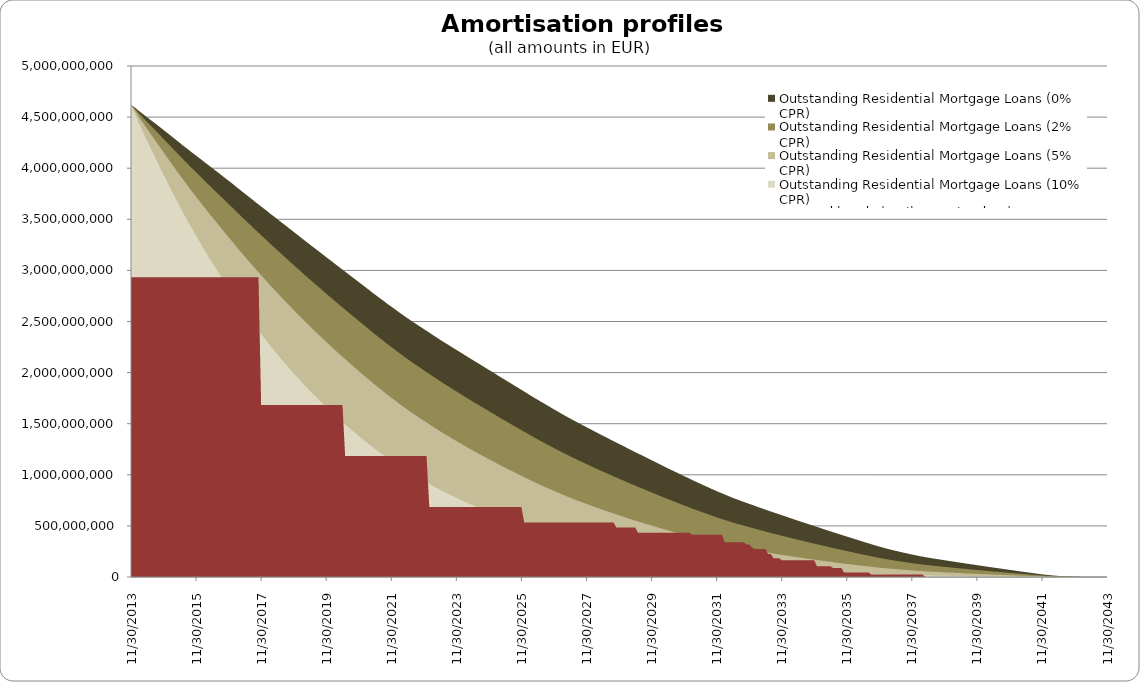
| Category | Outstanding Residential Mortgage Loans (0% CPR) | Outstanding Residential Mortgage Loans (2% CPR) | Outstanding Residential Mortgage Loans (5% CPR) | Outstanding Residential Mortgage Loans (10% CPR) | Covered bonds (until maturity date) |
|---|---|---|---|---|---|
| 11/30/13 | 4621074291.54 | 4621074291.54 | 4621074291.54 | 4621074291.54 | 2934000000 |
| 12/31/13 | 4601252980.262 | 4593513014.77 | 4581627168.501 | 4561030616.596 | 2934000000 |
| 1/31/14 | 4580651775.31 | 4565254115.916 | 4541659229.008 | 4500917258.503 | 2934000000 |
| 2/28/14 | 4559665125.302 | 4536693783.183 | 4501568352.734 | 4441130917.11 | 2934000000 |
| 3/31/14 | 4538963373.939 | 4508499608.352 | 4462016919.609 | 4382320956.442 | 2934000000 |
| 4/30/14 | 4518587627.42 | 4480710720.265 | 4423040103.859 | 4324511812.636 | 2934000000 |
| 5/31/14 | 4497774822.879 | 4452569901.039 | 4383888614.125 | 4266963852.63 | 2934000000 |
| 6/30/14 | 4477035793.324 | 4424583983.613 | 4345062242.59 | 4210160934.3 | 2934000000 |
| 7/31/14 | 4456941978.755 | 4397316206.714 | 4307110856.578 | 4154626499.014 | 2934000000 |
| 8/31/14 | 4436560420.215 | 4369844227.633 | 4269127283.019 | 4099475382.028 | 2934000000 |
| 9/30/14 | 4416366118.56 | 4342636361.277 | 4231568798.787 | 4045142520.036 | 2934000000 |
| 10/31/14 | 4395369128.176 | 4314719704.374 | 4193487222.06 | 3990717517.311 | 2934000000 |
| 11/30/14 | 4374080577.144 | 4286598948.105 | 4155376539.539 | 3936672519.43 | 2934000000 |
| 12/31/14 | 4352986486.934 | 4258750841.56 | 4117698621.928 | 3883440934.704 | 2934000000 |
| 1/31/15 | 4331947327.743 | 4231037946.011 | 4080318261.407 | 3830887762.307 | 2934000000 |
| 2/28/15 | 4311955959.469 | 4204427894.436 | 4044164586.459 | 3779875129.674 | 2934000000 |
| 3/31/15 | 4290933717.054 | 4176891919.646 | 4007282363.256 | 3728565853.562 | 2934000000 |
| 4/30/15 | 4269622600.501 | 4149155963.09 | 3970372565.841 | 3677615969.635 | 2934000000 |
| 5/31/15 | 4248157493.559 | 4121352103.711 | 3933562140.278 | 3627140450.174 | 2934000000 |
| 6/30/15 | 4226779486.51 | 4093714402.846 | 3897073804.805 | 3577340097.655 | 2934000000 |
| 7/31/15 | 4205687374.473 | 4066434449.566 | 3861087646.14 | 3528373097.802 | 2934000000 |
| 8/31/15 | 4185111866.955 | 4039733351.445 | 3825809826.614 | 3480418449.427 | 2934000000 |
| 9/30/15 | 4164024399.961 | 4012617233.167 | 3790296693.366 | 3432610545.158 | 2934000000 |
| 10/31/15 | 4143877432.152 | 3986485686.486 | 3755869343.318 | 3386141041.547 | 2934000000 |
| 11/30/15 | 4123330895.158 | 3960046954.6 | 3721306112.263 | 3339898016.831 | 2934000000 |
| 12/31/15 | 4103141311.476 | 3934028130.73 | 3687290175.77 | 3294491320.889 | 2934000000 |
| 1/31/16 | 4082823829.84 | 3907963213.702 | 3653382269.517 | 3249521466.339 | 2934000000 |
| 2/29/16 | 4062377747.168 | 3881851968.644 | 3619581952.625 | 3204984621.042 | 2934000000 |
| 3/31/16 | 4042111152.922 | 3855988737.386 | 3586162748.938 | 3161118475.542 | 2934000000 |
| 4/30/16 | 4021824648.927 | 3830182572.839 | 3552945193.207 | 3117758907.295 | 2934000000 |
| 5/31/16 | 4001475310.898 | 3804392576.121 | 3519890490.552 | 3074867558.273 | 2934000000 |
| 6/30/16 | 3980975869.834 | 3778536037.306 | 3486921652.603 | 3032373509.308 | 2934000000 |
| 7/31/16 | 3959728800.956 | 3752047305.475 | 3453517969.9 | 2989822921.208 | 2934000000 |
| 8/31/16 | 3938960513.928 | 3726089906.038 | 3420751597.423 | 2948142880.551 | 2934000000 |
| 9/30/16 | 3918192509.369 | 3700209483.88 | 3388202160.882 | 2906963280.109 | 2934000000 |
| 10/31/16 | 3897396493.908 | 3674379180.662 | 3355844037.634 | 2866257747.458 | 2934000000 |
| 11/30/16 | 3876961200.552 | 3648964815.87 | 3324009582.185 | 2826304707.449 | 2934000000 |
| 12/31/16 | 3856518534.664 | 3623618625.268 | 3292379348.224 | 2786825822.921 | 2934000000 |
| 1/31/17 | 3835523416.758 | 3597829168.87 | 3260488839.581 | 2747425454.782 | 2934000000 |
| 2/28/17 | 3814011280.709 | 3571632057.605 | 3228372850.183 | 2708133866.073 | 2934000000 |
| 3/31/17 | 3793302379.988 | 3546263828.022 | 3197148510.443 | 2669884623.343 | 2934000000 |
| 4/30/17 | 3772406788.682 | 3520796596.356 | 3165975123.551 | 2631966904.837 | 2934000000 |
| 5/31/17 | 3751291790.485 | 3495200583.214 | 3134826150.093 | 2594356350.79 | 2934000000 |
| 6/30/17 | 3730357055.096 | 3469848394.562 | 3104035294.472 | 2557325803.191 | 2934000000 |
| 7/31/17 | 3709323956.133 | 3444480265.793 | 3073368572.588 | 2520677578.288 | 2934000000 |
| 8/31/17 | 3688350794.591 | 3419243228.663 | 3042956437.625 | 2484515035.473 | 2934000000 |
| 9/30/17 | 3666586600.319 | 3393349266.935 | 3012097988.225 | 2448263918.531 | 2934000000 |
| 10/31/17 | 3646099663.8 | 3368712831.161 | 2982492213.307 | 2413302132.477 | 2934000000 |
| 11/30/17 | 3625448767.179 | 3343998446.925 | 2952950647.293 | 2378656932.521 | 1684000000 |
| 12/31/17 | 3604673633.879 | 3319243276.402 | 2923506070.355 | 2344352226.959 | 1684000000 |
| 1/31/18 | 3583946178.986 | 3294605756.595 | 2894297454.397 | 2310496247.213 | 1684000000 |
| 2/28/18 | 3563362598.021 | 3270173766.517 | 2865400512.245 | 2277144978.529 | 1684000000 |
| 3/31/18 | 3542708820.356 | 3245750340.538 | 2836641220.356 | 2244155770.158 | 1684000000 |
| 4/30/18 | 3522177680.612 | 3221511994.965 | 2808172909.013 | 2211646316.403 | 1684000000 |
| 5/31/18 | 3501551113.3 | 3197258877.257 | 2779820085.175 | 2179474346.173 | 1684000000 |
| 6/30/18 | 3480560590.414 | 3172746470.111 | 2751370334.779 | 2147471284.033 | 1684000000 |
| 7/31/18 | 3459784586.482 | 3148502702.112 | 2723281558.721 | 2115992392.951 | 1684000000 |
| 8/31/18 | 3439223274.455 | 3124526565.32 | 2695550609.227 | 2085029911.478 | 1684000000 |
| 9/30/18 | 3418477731.022 | 3100455089.744 | 2667862902.282 | 2054336342.68 | 1684000000 |
| 10/31/18 | 3397728402.526 | 3076452330.208 | 2640359407.655 | 2024017812.2 | 1684000000 |
| 11/30/18 | 3376773101.955 | 3052335366.072 | 2612882621.099 | 1993950738.843 | 1684000000 |
| 12/31/18 | 3356278730.223 | 3028706775.292 | 2585947330.983 | 1964524463.677 | 1684000000 |
| 1/31/19 | 3335489959.821 | 3004883823.269 | 2558968417.913 | 1935289472.719 | 1684000000 |
| 2/28/19 | 3315007106.901 | 2981407579.021 | 2532406302.197 | 1906591427.194 | 1684000000 |
| 3/31/19 | 3294527784.11 | 2958004982.019 | 2506026909.916 | 1878249240.923 | 1684000000 |
| 4/30/19 | 3274023946.796 | 2934650708.893 | 2479807911.018 | 1850243020.806 | 1684000000 |
| 5/31/19 | 3253359113.12 | 2911222572.305 | 2453645561.001 | 1822492725.1 | 1684000000 |
| 6/30/19 | 3232900398.663 | 2888049082.414 | 2427816068.2 | 1795200660.152 | 1684000000 |
| 7/31/19 | 3212477783.968 | 2864977511.834 | 2402189272.966 | 1768266354.488 | 1684000000 |
| 8/31/19 | 3191926135.599 | 2841860507.04 | 2376640844.542 | 1741595361.657 | 1684000000 |
| 9/30/19 | 3171529484.01 | 2818950931.856 | 2351381572.351 | 1715339370.989 | 1684000000 |
| 10/31/19 | 3151057307.56 | 2796043376.134 | 2326238787.135 | 1689368842.182 | 1684000000 |
| 11/30/19 | 3130270164.737 | 2772925900.777 | 2301036177.174 | 1663553897.227 | 1684000000 |
| 12/31/19 | 3109853789.624 | 2750206174.256 | 2276277626.948 | 1638256506.224 | 1684000000 |
| 1/31/20 | 3089623865.296 | 2727719649.211 | 2251824310.57 | 1613371634.733 | 1684000000 |
| 2/29/20 | 3069353296.085 | 2705265168.577 | 2227508689.053 | 1588775602.088 | 1684000000 |
| 3/31/20 | 3048432803.796 | 2682306650.129 | 2202889871.907 | 1564152825.673 | 1684000000 |
| 4/30/20 | 3028224903.328 | 2660043668.629 | 2178953287.812 | 1540201563.097 | 1684000000 |
| 5/31/20 | 3008093508.628 | 2637915084.9 | 2155235636.45 | 1516588091.754 | 1684000000 |
| 6/30/20 | 2987752004.855 | 2615669479.529 | 2131530774.478 | 1493164759.099 | 1184000000 |
| 7/31/20 | 2967175344.902 | 2593285724.834 | 2107821870.185 | 1469918554.35 | 1184000000 |
| 8/31/20 | 2946667697.514 | 2571030088.476 | 2084325254.397 | 1446998557.237 | 1184000000 |
| 9/30/20 | 2926440328.145 | 2549086128.416 | 2061188141.544 | 1424503381.943 | 1184000000 |
| 10/31/20 | 2906029206.193 | 2527048927.419 | 2038081612.691 | 1402202258.146 | 1184000000 |
| 11/30/20 | 2885564656.009 | 2505032271.322 | 2015097384.684 | 1380156621.062 | 1184000000 |
| 12/31/20 | 2865046229.902 | 2483035843.792 | 1992234687.207 | 1358363719.707 | 1184000000 |
| 1/31/21 | 2844933320.546 | 2461457185.057 | 1969811139.946 | 1337036942.792 | 1184000000 |
| 2/28/21 | 2825282380.935 | 2440343126.279 | 1947861133.632 | 1316194441.071 | 1184000000 |
| 3/31/21 | 2805622489.746 | 2419285416.784 | 1926056393.906 | 1295610028.384 | 1184000000 |
| 4/30/21 | 2783943236.362 | 2396553281.157 | 1903021848.668 | 1274360548.102 | 1184000000 |
| 5/31/21 | 2763954445.915 | 2375343561.929 | 1881299382.98 | 1254150623.358 | 1184000000 |
| 6/30/21 | 2744137347.994 | 2354345721.758 | 1859843966.679 | 1234273877.914 | 1184000000 |
| 7/31/21 | 2723945014.857 | 2333090407.649 | 1838284120.474 | 1214481505.536 | 1184000000 |
| 8/31/21 | 2704683338.298 | 2312695718.778 | 1817499744.258 | 1195352160.018 | 1184000000 |
| 9/30/21 | 2683581890.655 | 2290792554.576 | 1795628205.622 | 1175658460.008 | 1184000000 |
| 10/31/21 | 2664406662.974 | 2270598051.414 | 1775193548.879 | 1157054211.185 | 1184000000 |
| 11/30/21 | 2645454065.754 | 2250654413.534 | 1755048242.103 | 1138781222.932 | 1184000000 |
| 12/31/21 | 2626938360.736 | 2231142512.33 | 1735331097.861 | 1120925710.475 | 1184000000 |
| 1/31/22 | 2607020992.682 | 2210501410.878 | 1714828248.837 | 1102702483.198 | 1184000000 |
| 2/28/22 | 2588380923.73 | 2191004644.808 | 1695305320.542 | 1085247742.158 | 1184000000 |
| 3/31/22 | 2569766890.124 | 2171589217.23 | 1675934717.509 | 1068024720.68 | 1184000000 |
| 4/30/22 | 2550912115.577 | 2152029811.881 | 1656542180.752 | 1050920704.67 | 1184000000 |
| 5/31/22 | 2532430473.223 | 2132844321.362 | 1637525860.175 | 1034186485.985 | 1184000000 |
| 6/30/22 | 2514733619.1 | 2114377133.113 | 1619146919.698 | 1017982217.255 | 1184000000 |
| 7/31/22 | 2495960647.858 | 2095062765.731 | 1600205054.029 | 1001550410.185 | 1184000000 |
| 8/31/22 | 2478303528.994 | 2076742446.86 | 1582107659.59 | 985771937.334 | 1184000000 |
| 9/30/22 | 2460771968.582 | 2058582871.431 | 1564215345.534 | 970242293.854 | 1184000000 |
| 10/31/22 | 2443526588.396 | 2040717517.492 | 1546628020.926 | 955020679.422 | 1184000000 |
| 11/30/22 | 2426254166.796 | 2022883896.691 | 1529145225.592 | 939980570.886 | 1184000000 |
| 12/31/22 | 2409109933.989 | 2005211195.829 | 1511863877.742 | 925179661.841 | 1184000000 |
| 1/31/23 | 2391637360.125 | 1987319393.205 | 1494496955.723 | 910440699.165 | 684000000 |
| 2/28/23 | 2374440866.519 | 1969711130.927 | 1477422463.717 | 895992900.787 | 684000000 |
| 3/31/23 | 2357154112.644 | 1952081737.122 | 1460410515.444 | 881694363.267 | 684000000 |
| 4/30/23 | 2340129209.119 | 1934722566.544 | 1443678352.652 | 867674430.33 | 684000000 |
| 5/31/23 | 2322290117.016 | 1916744267.455 | 1426562208.558 | 853532990.83 | 684000000 |
| 6/30/23 | 2305470486.867 | 1899660995.401 | 1410189385.146 | 839943901.115 | 684000000 |
| 7/31/23 | 2289060245.302 | 1882966532.127 | 1394179622.569 | 826675016.828 | 684000000 |
| 8/31/23 | 2272542859.726 | 1866234871.84 | 1378215798.761 | 813535573.876 | 684000000 |
| 9/30/23 | 2255782053.727 | 1849354609.176 | 1362215797.06 | 800476300.874 | 684000000 |
| 10/31/23 | 2239392637.208 | 1832829820.057 | 1346550528.06 | 787713817.315 | 684000000 |
| 11/30/23 | 2223061478.074 | 1816402993.101 | 1331028993.468 | 775133605.976 | 684000000 |
| 12/31/23 | 2206629762.595 | 1799944221.104 | 1315555418.755 | 762678389.283 | 684000000 |
| 1/31/24 | 2190103670.03 | 1783458827.693 | 1300133602.598 | 750349361.882 | 684000000 |
| 2/29/24 | 2173447396.703 | 1766917971.213 | 1284742458.92 | 738133394.569 | 684000000 |
| 3/31/24 | 2157005113.71 | 1750601388.117 | 1269584910.023 | 726145702.631 | 684000000 |
| 4/30/24 | 2140638472.661 | 1734395985.15 | 1254577623.399 | 714336429.189 | 684000000 |
| 5/31/24 | 2124384035.739 | 1718330906.923 | 1239740740.442 | 702715246.384 | 684000000 |
| 6/30/24 | 2108091705.647 | 1702284370.632 | 1224985583.006 | 691230229.626 | 684000000 |
| 7/31/24 | 2091805546.79 | 1686291930.576 | 1210337312.718 | 679894314.809 | 684000000 |
| 8/31/24 | 2075588049.252 | 1670403734.722 | 1195831272.58 | 668725888.621 | 684000000 |
| 9/30/24 | 2059148945.651 | 1654386174.235 | 1181299827.7 | 657629993.12 | 684000000 |
| 10/31/24 | 2042601162.961 | 1638330604.983 | 1166808508.762 | 646642582.798 | 684000000 |
| 11/30/24 | 2026222536.19 | 1622459819.676 | 1152515534.604 | 635850097.658 | 684000000 |
| 12/31/24 | 2010059004.711 | 1606809735.063 | 1138445084.362 | 625263796.281 | 684000000 |
| 1/31/25 | 1993900454.198 | 1591211686.402 | 1124476505.147 | 614815524.312 | 684000000 |
| 2/28/25 | 1977719252.578 | 1575643521.444 | 1110593655.347 | 604495217.526 | 684000000 |
| 3/31/25 | 1961200786.207 | 1559854983.564 | 1096620193.333 | 594206177.282 | 684000000 |
| 4/30/25 | 1945055489.382 | 1544411409.47 | 1082953500.825 | 584162905.116 | 684000000 |
| 5/31/25 | 1928931595.657 | 1529032343.023 | 1069395307.602 | 574256185.858 | 684000000 |
| 6/30/25 | 1912744652.486 | 1513650752.355 | 1055898268.209 | 564459422.32 | 684000000 |
| 7/31/25 | 1896478754.264 | 1498254207.242 | 1042453511.584 | 554766960.196 | 684000000 |
| 8/31/25 | 1880224340.931 | 1482914235.101 | 1029110523.277 | 545204149.003 | 684000000 |
| 9/30/25 | 1863968368.066 | 1467620404.67 | 1015861543.424 | 535765686.288 | 684000000 |
| 10/31/25 | 1847715173.119 | 1452376013.278 | 1002708371.491 | 526451367.43 | 684000000 |
| 11/30/25 | 1831606087.366 | 1437291840.619 | 989726793.581 | 517299651.895 | 684000000 |
| 12/31/25 | 1814586869.128 | 1421541310.7 | 976348013.29 | 508012908.475 | 534000000 |
| 1/31/26 | 1798479514.298 | 1406552853.237 | 963553897.147 | 499102051.539 | 534000000 |
| 2/28/26 | 1782595464.337 | 1391785145.822 | 950970286.466 | 490369592.536 | 534000000 |
| 3/31/26 | 1766177259.3 | 1376646794.114 | 938192750.809 | 481606012.003 | 534000000 |
| 4/30/26 | 1750252699.007 | 1361939559.406 | 925768019.326 | 473091606.796 | 534000000 |
| 5/31/26 | 1734664906.84 | 1347539519.278 | 913609578.401 | 464779490.453 | 534000000 |
| 6/30/26 | 1719118710.748 | 1333216330.278 | 901559828.806 | 456587592.514 | 534000000 |
| 7/31/26 | 1703499101.892 | 1318880677.844 | 889557914.571 | 448484072.091 | 534000000 |
| 8/31/26 | 1687770844.368 | 1304505506.825 | 877585488.627 | 440458981.733 | 534000000 |
| 9/30/26 | 1672191238.74 | 1290289667.041 | 865775975.427 | 432578378.997 | 534000000 |
| 10/31/26 | 1656151015.445 | 1275763139.966 | 853813772.183 | 424683782.415 | 534000000 |
| 11/30/26 | 1640656397.727 | 1261701417.194 | 842217944.805 | 417032838.693 | 534000000 |
| 12/31/26 | 1625702759.267 | 1248098716.355 | 830982026.405 | 409619512.944 | 534000000 |
| 1/31/27 | 1609948337.807 | 1233924458.778 | 819419060.076 | 402103923.187 | 534000000 |
| 2/28/27 | 1595061504.001 | 1220458189.846 | 808379309.205 | 394903224.869 | 534000000 |
| 3/31/27 | 1580381196.069 | 1207191491.274 | 797523048.419 | 387848374.122 | 534000000 |
| 4/30/27 | 1565759246.303 | 1194010474.678 | 786774015.561 | 380900884.94 | 534000000 |
| 5/31/27 | 1551225639.846 | 1180937641.418 | 776146371.738 | 374066526.584 | 534000000 |
| 6/30/27 | 1536618221.037 | 1167849312.331 | 765558299.605 | 367304904.916 | 534000000 |
| 7/31/27 | 1522362795.01 | 1155068743.262 | 755221048.779 | 360716316.403 | 534000000 |
| 8/31/27 | 1508067752.044 | 1142297859.666 | 744938484.151 | 354205544.765 | 534000000 |
| 9/30/27 | 1494082433.552 | 1129800879.824 | 734882237.97 | 347853147.712 | 534000000 |
| 10/31/27 | 1480177104.203 | 1117403096.925 | 724937401.536 | 341603204.377 | 534000000 |
| 11/30/27 | 1466157315.085 | 1104957564.113 | 715008211.454 | 335409763.763 | 534000000 |
| 12/31/27 | 1451903832.101 | 1092374915.914 | 705037055.505 | 329245506.782 | 534000000 |
| 1/31/28 | 1438200164.325 | 1080244442.913 | 695403800.076 | 323286980.251 | 534000000 |
| 2/29/28 | 1424228338.973 | 1067950612.775 | 685710787.7 | 317347717.812 | 534000000 |
| 3/31/28 | 1410659879.5 | 1055997038.59 | 676281188.564 | 311576680.976 | 534000000 |
| 4/30/28 | 1397111755.722 | 1044095855.466 | 666929262.054 | 305886742.4 | 534000000 |
| 5/31/28 | 1383644087.245 | 1032291748.08 | 657683052.681 | 300289933.745 | 534000000 |
| 6/30/28 | 1370203613.71 | 1020544654.348 | 648516457.813 | 294773451.747 | 534000000 |
| 7/31/28 | 1356240526.773 | 1008445565.942 | 639169796.308 | 289219020.635 | 534000000 |
| 8/31/28 | 1342495308.682 | 996546021.181 | 629993309.161 | 283785228.839 | 534000000 |
| 9/30/28 | 1328920870.246 | 984810214.392 | 620963274.953 | 278460120.322 | 534000000 |
| 10/31/28 | 1315553873.272 | 973264537.789 | 612095328.208 | 273249514.187 | 484000000 |
| 11/30/28 | 1302234695.84 | 961790235.673 | 603313887.94 | 268118573.052 | 484000000 |
| 12/31/28 | 1288850312.223 | 950303703.684 | 594566142.889 | 263043148.615 | 484000000 |
| 1/31/29 | 1275540792.06 | 938908200.343 | 585916434.439 | 258051115.465 | 484000000 |
| 2/28/29 | 1262223885.099 | 927542917.144 | 577326318.376 | 253124777.418 | 484000000 |
| 3/31/29 | 1249006137.582 | 916285958.05 | 568843981.735 | 248284559.364 | 484000000 |
| 4/30/29 | 1235793326.982 | 905067862.53 | 560425741.383 | 243510594.845 | 484000000 |
| 5/31/29 | 1222304973.927 | 893683452.36 | 551944540.061 | 238747300.849 | 484000000 |
| 6/30/29 | 1209104418.97 | 882544850.906 | 543654897.642 | 234104399.947 | 434000000 |
| 7/31/29 | 1195907268.064 | 871443674.784 | 535427453.455 | 229525081.242 | 434000000 |
| 8/31/29 | 1182743984.103 | 860401985.424 | 527275401.844 | 225014377.071 | 434000000 |
| 9/30/29 | 1169597572.109 | 849407230.819 | 519190640.659 | 220568176.847 | 434000000 |
| 10/31/29 | 1156466776.3 | 838458352.618 | 511172158.032 | 216185435.2 | 434000000 |
| 11/30/29 | 1143082188.541 | 827360212.111 | 503100932.031 | 211815435.133 | 434000000 |
| 12/31/29 | 1129572930.173 | 816206952.469 | 495034621.628 | 207482417.154 | 434000000 |
| 1/31/30 | 1116624082.909 | 805493135.166 | 487272522.263 | 203311005.948 | 434000000 |
| 2/28/30 | 1103731054.812 | 794853251.326 | 479591886.837 | 199206743.802 | 434000000 |
| 3/31/30 | 1090875757.544 | 784274009.862 | 471984231.987 | 195165452.06 | 434000000 |
| 4/30/30 | 1077790109.798 | 773562780.511 | 464333510.314 | 191138740.533 | 434000000 |
| 5/31/30 | 1064223167.935 | 762540509.986 | 456533000.202 | 187082907.801 | 434000000 |
| 6/30/30 | 1051193364.651 | 751937357.564 | 449020026.117 | 183176978.008 | 434000000 |
| 7/31/30 | 1038401113.913 | 741537358.719 | 441663875.777 | 179366073.152 | 434000000 |
| 8/31/30 | 1025738802.237 | 731262855.981 | 434417340.261 | 175630046.215 | 434000000 |
| 9/30/30 | 1013097413.347 | 721035712.74 | 427233410.479 | 171949181.289 | 434000000 |
| 10/31/30 | 999862685.709 | 710419329.876 | 419853711.168 | 168219424.897 | 434000000 |
| 11/30/30 | 987363038.355 | 700358031.846 | 412836544.617 | 164664326.958 | 434000000 |
| 12/31/30 | 974922140.156 | 690370174.174 | 405896059.624 | 161168241.631 | 434000000 |
| 1/31/31 | 962209455.776 | 680221801.849 | 398894598.871 | 157676158.902 | 434000000 |
| 2/28/31 | 949896055.064 | 670387411.101 | 392110302.623 | 154297670.862 | 414000000 |
| 3/31/31 | 937078333.401 | 660228857.03 | 385169331.467 | 150884996.63 | 414000000 |
| 4/30/31 | 924844384.239 | 650513193.783 | 378519363.465 | 147613371.718 | 414000000 |
| 5/31/31 | 912666343.941 | 640867606.832 | 371941901.391 | 144396260.73 | 414000000 |
| 6/30/31 | 900447141.939 | 631223775.528 | 365396959.669 | 141217660.136 | 414000000 |
| 7/31/31 | 888365594.916 | 621706909.991 | 358956704.989 | 138104997.351 | 414000000 |
| 8/31/31 | 876353299.347 | 612268659.049 | 352592604.288 | 135046634.091 | 414000000 |
| 9/30/31 | 864259986.792 | 602803893.971 | 346243806.319 | 132018812.219 | 414000000 |
| 10/31/31 | 852439662.325 | 593559322.062 | 340051651.553 | 129074942.358 | 414000000 |
| 11/30/31 | 840650637.156 | 584365903.432 | 333918453.542 | 126177149.706 | 414000000 |
| 12/31/31 | 829068159.438 | 575345071.221 | 327913082.361 | 123350887.321 | 414000000 |
| 1/31/32 | 817957548.759 | 566679843.004 | 322138703.111 | 120633987.395 | 414000000 |
| 2/29/32 | 807226550.18 | 558304691.713 | 316556482.85 | 118010657.943 | 339000000 |
| 3/31/32 | 796549386.486 | 549993284.425 | 311037043.334 | 115431775.916 | 339000000 |
| 4/30/32 | 785322801.124 | 541329538.344 | 305345306.123 | 112810039.527 | 339000000 |
| 5/31/32 | 774523291.563 | 532987275.21 | 299861809.604 | 110286131.203 | 339000000 |
| 6/30/32 | 764431162.697 | 525157510.063 | 294692234.892 | 107897573.527 | 339000000 |
| 7/31/32 | 754424147.214 | 517410951.993 | 289593975.888 | 105554256.454 | 339000000 |
| 8/31/32 | 744616488.678 | 509825465.747 | 284610046.301 | 103271312.052 | 339000000 |
| 9/30/32 | 734920784.087 | 502340559.35 | 279705972.754 | 101035606.382 | 339000000 |
| 10/31/32 | 725299846.74 | 494930411.143 | 274866890.897 | 98841285.398 | 319000000 |
| 11/30/32 | 715746450.917 | 487589783.491 | 270089487.773 | 96686730.999 | 319000000 |
| 12/31/32 | 706264835.12 | 480321267.367 | 265374809.521 | 94571904.011 | 289000000 |
| 1/31/33 | 696835122.061 | 473111064.177 | 260714855.594 | 92493552.123 | 274000000 |
| 2/28/33 | 687478397.932 | 465973230.731 | 256117017.871 | 90453912.866 | 274000000 |
| 3/31/33 | 678156500.963 | 458881639.032 | 251566578.325 | 88447407.416 | 274000000 |
| 4/30/33 | 668876628.555 | 451840974.862 | 247065820.406 | 86474502.918 | 274000000 |
| 5/31/33 | 659642861.595 | 444853792.124 | 242615837.751 | 84535241.326 | 274000000 |
| 6/30/33 | 650270226.007 | 437795344.59 | 238148463.57 | 82605635.211 | 224000000 |
| 7/31/33 | 641132326.667 | 430917155.436 | 233800385.599 | 80732863.59 | 224000000 |
| 8/31/33 | 632053359.437 | 424100410.422 | 229506465.998 | 78893877.479 | 184000000 |
| 9/30/33 | 623004022.781 | 417325227.991 | 225255635.854 | 77084540.055 | 184000000 |
| 10/31/33 | 613996803.36 | 410599803.958 | 221052056.281 | 75305972.364 | 184000000 |
| 11/30/33 | 605015352.043 | 403913028.645 | 216889474.806 | 73555742.12 | 164000000 |
| 12/31/33 | 596068705.461 | 397270784.4 | 212770805.101 | 71834551.25 | 164000000 |
| 1/31/34 | 587126401.604 | 390652633.102 | 208684868.024 | 70138350.676 | 164000000 |
| 2/28/34 | 578200842.04 | 384066745.41 | 204635841.727 | 68468298.56 | 164000000 |
| 3/31/34 | 569286540.368 | 377509374.711 | 200621527.342 | 66823405.747 | 164000000 |
| 4/30/34 | 560386235.885 | 370982244.114 | 196642645.919 | 65203667.626 | 164000000 |
| 5/31/34 | 551490612.242 | 364479098.35 | 192695692.888 | 63607681.399 | 164000000 |
| 6/30/34 | 542644886.279 | 358029702.973 | 188796192.696 | 62040320.154 | 164000000 |
| 7/31/34 | 533828491.251 | 351620293.428 | 184936613.392 | 60498825.086 | 164000000 |
| 8/31/34 | 525046958.299 | 345254358.125 | 181118549.562 | 58983456.067 | 164000000 |
| 9/30/34 | 516302366.551 | 338933095.318 | 177342380.656 | 57494071.082 | 164000000 |
| 10/31/34 | 507575908.246 | 332644005.675 | 173601331.919 | 56028219.465 | 164000000 |
| 11/30/34 | 498876366.932 | 326392726.117 | 169898137.217 | 54586547.706 | 164000000 |
| 12/31/34 | 490216333.331 | 320187340.868 | 166236772.05 | 53170084.642 | 104000000 |
| 1/31/35 | 481577268.899 | 314015582.177 | 162610630.309 | 51776468.967 | 104000000 |
| 2/28/35 | 472973406.747 | 307886596.22 | 159024233.142 | 50406906.702 | 104000000 |
| 3/31/35 | 464379539.33 | 301783836.578 | 155468817.952 | 49058388.233 | 104000000 |
| 4/30/35 | 455800113.107 | 295710106.216 | 151945653.785 | 47731106.616 | 104000000 |
| 5/31/35 | 447246884.184 | 289672923.221 | 148458412.01 | 46426000.807 | 104000000 |
| 6/30/35 | 438321796.441 | 283414773.517 | 144875246.647 | 45101801.959 | 89000000 |
| 7/31/35 | 429806894.378 | 277441634.584 | 141454944.451 | 43839044.322 | 89000000 |
| 8/31/35 | 421320641.62 | 271506251.322 | 138070572.465 | 42597813.908 | 89000000 |
| 9/30/35 | 412851620.959 | 265601137.097 | 134718121.068 | 41376661.162 | 89000000 |
| 10/31/35 | 404408393.702 | 259731687.175 | 131400137.085 | 40176165.804 | 45000000 |
| 11/30/35 | 395990425.692 | 253897427.547 | 128116178.686 | 38995984.394 | 45000000 |
| 12/31/35 | 387603443.249 | 248101894.592 | 124867826.01 | 37836391.129 | 45000000 |
| 1/31/36 | 379240669.965 | 242340611.348 | 121652618.838 | 36696433.85 | 45000000 |
| 2/29/36 | 370919643.878 | 236624640.82 | 118475902.279 | 35577519.511 | 45000000 |
| 3/31/36 | 362611017.578 | 230935111.682 | 115328015.688 | 34476542.094 | 45000000 |
| 4/30/36 | 354325920.798 | 225279014.124 | 112212278.76 | 33394312.378 | 45000000 |
| 5/31/36 | 346054802.082 | 219650164.061 | 109125430.681 | 32329675.026 | 45000000 |
| 6/30/36 | 337802557.262 | 214051573.205 | 106068800.403 | 31282846.627 | 45000000 |
| 7/31/36 | 329569364.929 | 208483248.551 | 103042216.718 | 30253598.956 | 45000000 |
| 8/31/36 | 321396591.625 | 202971208.011 | 100058332.041 | 29245452.965 | 25000000 |
| 9/30/36 | 313257778.163 | 197498532.177 | 97108554.511 | 28255683.997 | 25000000 |
| 10/31/36 | 305363609.536 | 192197674.588 | 94257635.501 | 27302858.364 | 25000000 |
| 11/30/36 | 297691228.295 | 187053451.252 | 91497437.606 | 26384188.995 | 25000000 |
| 12/31/36 | 290320146.337 | 182114992.821 | 88851282.635 | 25505964.974 | 25000000 |
| 1/31/37 | 283189172.402 | 177342983.556 | 86299207.16 | 24661989.261 | 25000000 |
| 2/28/37 | 276087377.897 | 172604755.832 | 83776140.308 | 23833338.975 | 25000000 |
| 3/31/37 | 269373459.237 | 168124051.996 | 81390222.042 | 23050482.203 | 25000000 |
| 4/30/37 | 262721086.126 | 163696281.929 | 79041649.366 | 22284711.609 | 25000000 |
| 5/31/37 | 256343659.076 | 159453957.66 | 76793997.605 | 21553685.544 | 25000000 |
| 6/30/37 | 250128151.574 | 155325992.289 | 74612381.931 | 20847232.698 | 25000000 |
| 7/31/37 | 243958807.494 | 151240081.958 | 72461691.341 | 20155297.761 | 25000000 |
| 8/31/37 | 237902629.451 | 147237516.517 | 70361459.809 | 19483134.806 | 25000000 |
| 9/30/37 | 231913684.964 | 143289529.829 | 68297626.129 | 18826641.163 | 25000000 |
| 10/31/37 | 225997193.606 | 139399098.998 | 66271364.396 | 18185966.598 | 25000000 |
| 11/30/37 | 220152484.603 | 135565553.328 | 64282105.148 | 17560780.394 | 25000000 |
| 12/31/37 | 214644861 | 131951731.869 | 62406615.316 | 16971787.784 | 25000000 |
| 1/31/38 | 209372584.602 | 128494119.664 | 60614088.928 | 16410196.689 | 25000000 |
| 2/28/38 | 204286073.199 | 125161580.508 | 58889268.696 | 15871559.684 | 25000000 |
| 3/31/38 | 199331004.484 | 121920286.048 | 57215788.741 | 15351208.811 | 25000000 |
| 4/30/38 | 194522276.873 | 118778900.726 | 55597339.824 | 14849914.261 | 0 |
| 5/31/38 | 189869534.609 | 115742826.116 | 54036049.123 | 14368014.76 | 0 |
| 6/30/38 | 185377781 | 112814601.881 | 52532687.035 | 13905481.547 | 0 |
| 7/31/38 | 181036410.361 | 109987265.548 | 51083600.417 | 13461118.889 | 0 |
| 8/31/38 | 176895174.978 | 107290508.051 | 49702151.696 | 13038213.655 | 0 |
| 9/30/38 | 172772270.185 | 104613611.152 | 48336686.524 | 12623012.794 | 0 |
| 10/31/38 | 168666359.196 | 101955688.915 | 46986699.568 | 12215305.347 | 0 |
| 11/30/38 | 164569180.418 | 99311682.368 | 45649771.723 | 11814388.219 | 0 |
| 12/31/38 | 160330812.764 | 96591223.275 | 44284396.603 | 11409499.777 | 0 |
| 1/31/39 | 156255191.459 | 93977517.175 | 42974598.423 | 11022267.3 | 0 |
| 2/28/39 | 152194725.853 | 91381430.758 | 41679318.457 | 10641992.783 | 0 |
| 3/31/39 | 148140821.047 | 88797745.067 | 40396095.179 | 10267979.253 | 0 |
| 4/30/39 | 144091600.796 | 86225296.334 | 39124332.281 | 9900013.288 | 0 |
| 5/31/39 | 140045117.792 | 83662886.007 | 37863423.472 | 9537882.263 | 0 |
| 6/30/39 | 136004143.282 | 81112137.719 | 36614042.216 | 9181697.923 | 0 |
| 7/31/39 | 131984290.445 | 78582309.75 | 35380292.135 | 8832425.408 | 0 |
| 8/31/39 | 127985986.067 | 76073571.573 | 34162152.379 | 8489987.118 | 0 |
| 9/30/39 | 123995993.946 | 73577983.467 | 32955969.725 | 8153407.42 | 0 |
| 10/31/39 | 120026942.412 | 71102981.025 | 31764996.959 | 7823428.363 | 0 |
| 11/30/39 | 116089164.618 | 68654592.141 | 30591825.599 | 7500616.003 | 0 |
| 12/31/39 | 112181104.942 | 66231784.711 | 29435882.187 | 7184752.842 | 0 |
| 1/31/40 | 108295336.828 | 63830072.912 | 28295067.4 | 6875254.106 | 0 |
| 2/29/40 | 104431857.287 | 61449368.636 | 27169247.641 | 6572020.009 | 0 |
| 3/31/40 | 100581731.917 | 59084337.73 | 26055976.466 | 6274395.054 | 0 |
| 4/30/40 | 96738333.414 | 56731034.481 | 24953443.085 | 5981887.304 | 0 |
| 5/31/40 | 92911204.218 | 54395006.106 | 23864019.724 | 5695011.309 | 0 |
| 6/30/40 | 89095927.435 | 52073603.671 | 22786467.157 | 5413413.846 | 0 |
| 7/31/40 | 85296014.804 | 49768821.86 | 21721585.315 | 5137229.789 | 0 |
| 8/31/40 | 81506298.057 | 47477585.787 | 20667958.47 | 4866069.364 | 0 |
| 9/30/40 | 77722123.791 | 45197140.338 | 19624323.991 | 4599585.104 | 0 |
| 10/31/40 | 73944466.646 | 42928016.149 | 18590854.858 | 4337770.38 | 0 |
| 11/30/40 | 70177142.32 | 40672386.58 | 17568431.64 | 4080782.369 | 0 |
| 12/31/40 | 66418155.256 | 38429048.023 | 16556470.401 | 3828436.451 | 0 |
| 1/31/41 | 62661916.207 | 36194728.918 | 15553504.275 | 3580347.493 | 0 |
| 2/28/41 | 58921065.212 | 33976691.433 | 14562596.101 | 3337174.945 | 0 |
| 3/31/41 | 55190202.485 | 31771763.641 | 13582316.172 | 3098540.999 | 0 |
| 4/30/41 | 51471994.414 | 29581430.482 | 12613234.725 | 2864528.389 | 0 |
| 5/31/41 | 47765652.122 | 27405184.233 | 11655068.407 | 2635024.871 | 0 |
| 6/30/41 | 44059652.281 | 25236371.933 | 10704929.58 | 2409333.66 | 0 |
| 7/31/41 | 40367172.497 | 23082509.571 | 9765954.879 | 2188119.782 | 0 |
| 8/31/41 | 36704159.113 | 20952642.931 | 8841893.812 | 1972172.572 | 0 |
| 9/30/41 | 33077085.994 | 18850358.521 | 7934158.874 | 1761747.851 | 0 |
| 10/31/41 | 29598104.81 | 16839341.938 | 7069377.724 | 1562670.036 | 0 |
| 11/30/41 | 26307475.662 | 14942017.086 | 6256624.542 | 1376795.478 | 0 |
| 12/31/41 | 23254554.996 | 13185813.354 | 5506968.398 | 1206382.875 | 0 |
| 1/31/42 | 20388657.355 | 11541343.248 | 4807693.929 | 1048461.851 | 0 |
| 2/28/42 | 17781627.811 | 10048658.466 | 4175065.895 | 906405.213 | 0 |
| 3/31/42 | 15293057.836 | 8627793.461 | 3575442.384 | 772737.674 | 0 |
| 4/30/42 | 12991597.446 | 7317063.153 | 3024416.798 | 650709.557 | 0 |
| 5/31/42 | 10894250.787 | 6125484.658 | 2525341.346 | 540889.899 | 0 |
| 6/30/42 | 8968568.783 | 5034253.379 | 2070091.289 | 441389.018 | 0 |
| 7/31/42 | 7223845.927 | 4048081.436 | 1660269.014 | 352414.471 | 0 |
| 8/31/42 | 5681156.993 | 3178237.858 | 1300140.873 | 274731.799 | 0 |
| 9/30/42 | 4327896.936 | 2417104.099 | 986220.817 | 207460.739 | 0 |
| 10/31/42 | 3217836.926 | 1794119.288 | 730137.946 | 152900.857 | 0 |
| 11/30/42 | 2369749.95 | 1319042.068 | 535410.699 | 111618.27 | 0 |
| 12/31/42 | 1753770.802 | 974535.801 | 394549.041 | 81882.761 | 0 |
| 1/31/43 | 1287321.45 | 714135.805 | 288375.789 | 59579.043 | 0 |
| 2/28/43 | 917520.618 | 508134.256 | 204659.192 | 42092.937 | 0 |
| 3/31/43 | 621834.635 | 343800.409 | 138112.811 | 28278.423 | 0 |
| 4/30/43 | 388903.87 | 214655.779 | 86009.21 | 17531.11 | 0 |
| 5/31/43 | 212607.732 | 117151.597 | 46819.35 | 9500.207 | 0 |
| 6/30/43 | 82242.176 | 45241.041 | 18033.688 | 3642.801 | 0 |
| 7/31/43 | 14163.832 | 7778.352 | 3092.533 | 621.883 | 0 |
| 8/31/43 | 3135.363 | 1718.951 | 681.656 | 136.459 | 0 |
| 9/30/43 | 0 | 0 | 0 | 0 | 0 |
| 10/31/43 | 0 | 0 | 0 | 0 | 0 |
| 11/30/43 | 0 | 0 | 0 | 0 | 0 |